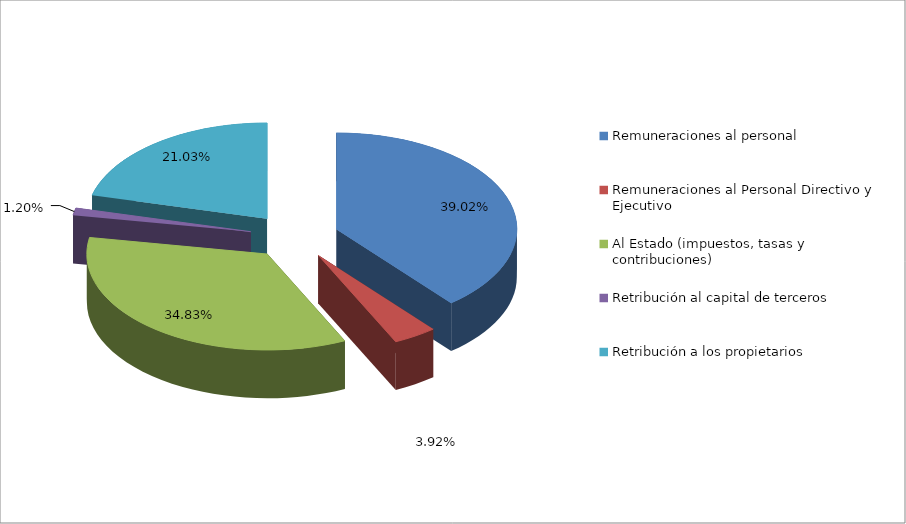
| Category | Series 0 |
|---|---|
| Remuneraciones al personal | 0.39 |
| Remuneraciones al Personal Directivo y Ejecutivo | 0.039 |
| Al Estado (impuestos, tasas y contribuciones) | 0.348 |
| Retribución al capital de terceros | 0.012 |
| Retribución a los propietarios | 0.21 |